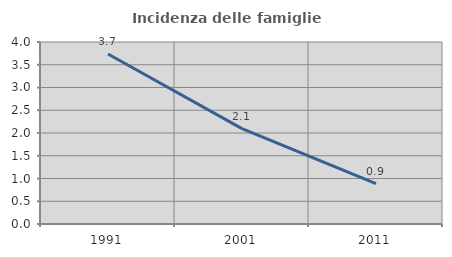
| Category | Incidenza delle famiglie numerose |
|---|---|
| 1991.0 | 3.736 |
| 2001.0 | 2.096 |
| 2011.0 | 0.888 |